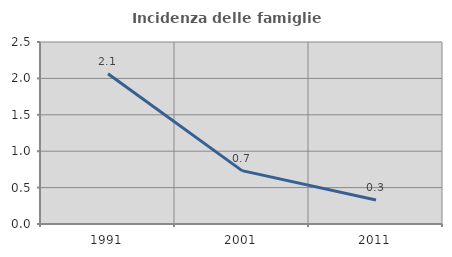
| Category | Incidenza delle famiglie numerose |
|---|---|
| 1991.0 | 2.063 |
| 2001.0 | 0.733 |
| 2011.0 | 0.33 |